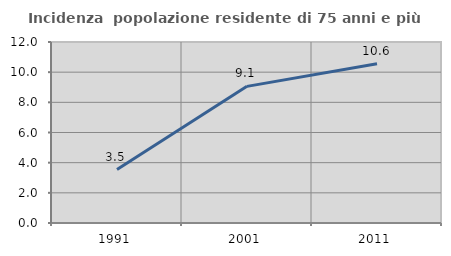
| Category | Incidenza  popolazione residente di 75 anni e più |
|---|---|
| 1991.0 | 3.546 |
| 2001.0 | 9.059 |
| 2011.0 | 10.561 |